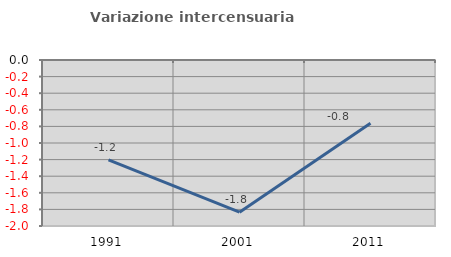
| Category | Variazione intercensuaria annua |
|---|---|
| 1991.0 | -1.202 |
| 2001.0 | -1.833 |
| 2011.0 | -0.763 |